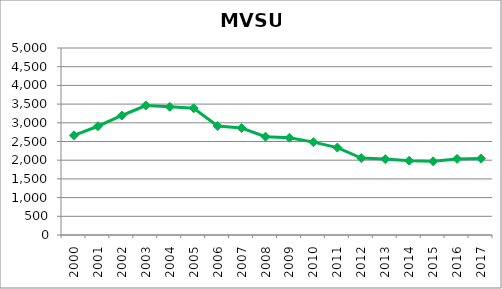
| Category | Series 0 |
|---|---|
| 2000.0 | 2664.308 |
| 2001.0 | 2908.025 |
| 2002.0 | 3195.358 |
| 2003.0 | 3462.75 |
| 2004.0 | 3427.692 |
| 2005.0 | 3389.008 |
| 2006.0 | 2914.1 |
| 2007.0 | 2860.175 |
| 2008.0 | 2628.508 |
| 2009.0 | 2599.208 |
| 2010.0 | 2482.767 |
| 2011.0 | 2336.942 |
| 2012.0 | 2055.658 |
| 2013.0 | 2028.875 |
| 2014.0 | 1985.95 |
| 2015.0 | 1970.042 |
| 2016.0 | 2035.083 |
| 2017.0 | 2042.492 |